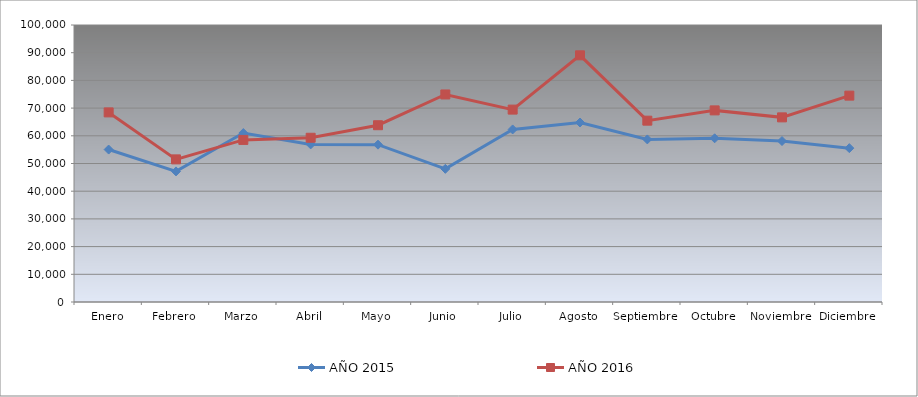
| Category | AÑO 2015 | AÑO 2016 |
|---|---|---|
| Enero | 55036.623 | 68447.46 |
| Febrero | 47144.287 | 51484.935 |
| Marzo | 60991.749 | 58516.356 |
| Abril | 56891.045 | 59294.168 |
| Mayo | 56797.221 | 63817.923 |
| Junio | 48071.498 | 74925.079 |
| Julio | 62299.779 | 69455.505 |
| Agosto | 64799.938 | 89056.368 |
| Septiembre | 58695.796 | 65466.885 |
| Octubre | 59098.692 | 69175.492 |
| Noviembre | 58110.77 | 66655.381 |
| Diciembre | 55544.381 | 74501.949 |